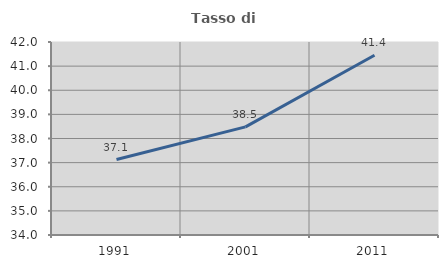
| Category | Tasso di occupazione   |
|---|---|
| 1991.0 | 37.128 |
| 2001.0 | 38.48 |
| 2011.0 | 41.448 |